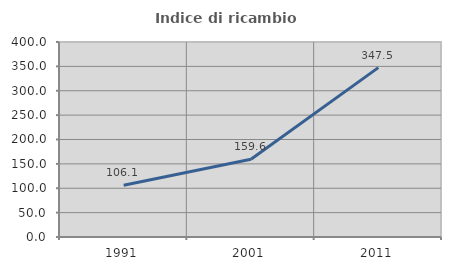
| Category | Indice di ricambio occupazionale  |
|---|---|
| 1991.0 | 106.111 |
| 2001.0 | 159.559 |
| 2011.0 | 347.5 |